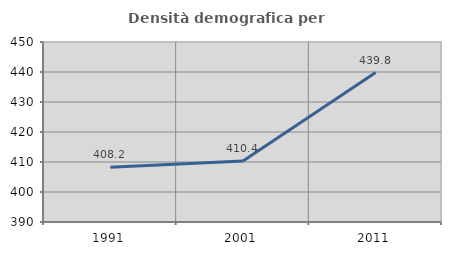
| Category | Densità demografica |
|---|---|
| 1991.0 | 408.234 |
| 2001.0 | 410.357 |
| 2011.0 | 439.795 |